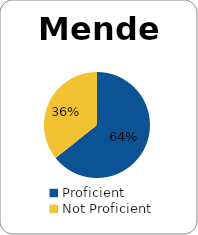
| Category | Series 0 |
|---|---|
| Proficient | 0.643 |
| Not Proficient | 0.357 |